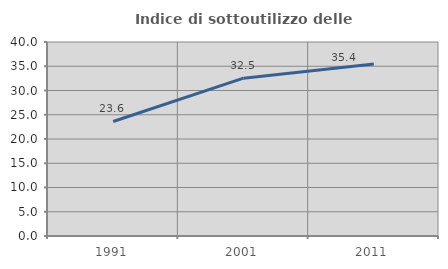
| Category | Indice di sottoutilizzo delle abitazioni  |
|---|---|
| 1991.0 | 23.615 |
| 2001.0 | 32.538 |
| 2011.0 | 35.441 |